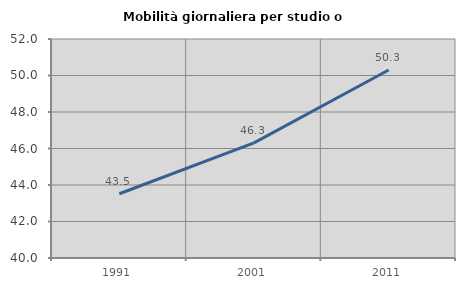
| Category | Mobilità giornaliera per studio o lavoro |
|---|---|
| 1991.0 | 43.52 |
| 2001.0 | 46.305 |
| 2011.0 | 50.301 |